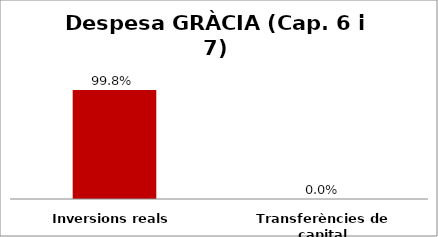
| Category | Series 0 |
|---|---|
| Inversions reals | 0.998 |
| Transferències de capital | 0 |